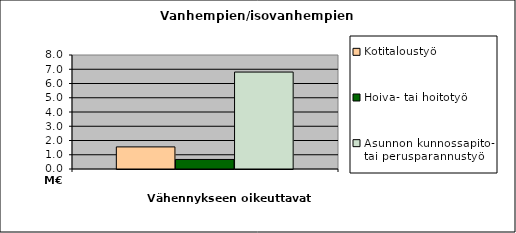
| Category | Kotitaloustyö | Hoiva- tai hoitotyö | Asunnon kunnossapito- tai perusparannustyö |
|---|---|---|---|
| 0 | 1550941.46 | 668905.81 | 6803217.33 |